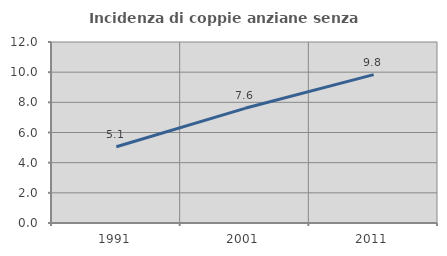
| Category | Incidenza di coppie anziane senza figli  |
|---|---|
| 1991.0 | 5.052 |
| 2001.0 | 7.603 |
| 2011.0 | 9.834 |